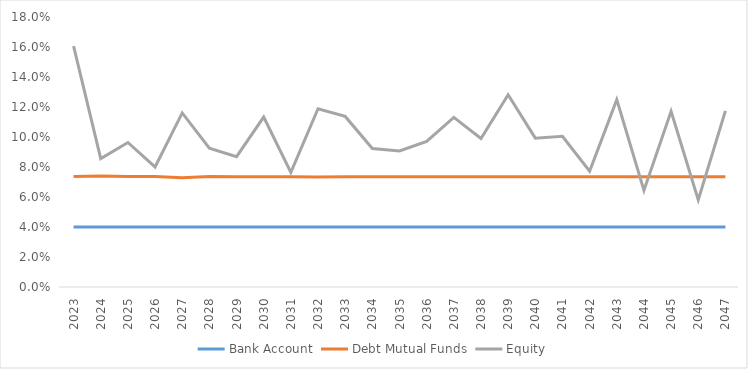
| Category | Bank Account | Debt Mutual Funds | Equity |
|---|---|---|---|
| 2023.0 | 0.04 | 0.074 | 0.161 |
| 2024.0 | 0.04 | 0.074 | 0.086 |
| 2025.0 | 0.04 | 0.074 | 0.096 |
| 2026.0 | 0.04 | 0.074 | 0.08 |
| 2027.0 | 0.04 | 0.073 | 0.116 |
| 2028.0 | 0.04 | 0.074 | 0.093 |
| 2029.0 | 0.04 | 0.074 | 0.087 |
| 2030.0 | 0.04 | 0.073 | 0.113 |
| 2031.0 | 0.04 | 0.073 | 0.076 |
| 2032.0 | 0.04 | 0.073 | 0.119 |
| 2033.0 | 0.04 | 0.074 | 0.114 |
| 2034.0 | 0.04 | 0.073 | 0.092 |
| 2035.0 | 0.04 | 0.073 | 0.091 |
| 2036.0 | 0.04 | 0.073 | 0.097 |
| 2037.0 | 0.04 | 0.073 | 0.113 |
| 2038.0 | 0.04 | 0.073 | 0.099 |
| 2039.0 | 0.04 | 0.073 | 0.128 |
| 2040.0 | 0.04 | 0.073 | 0.099 |
| 2041.0 | 0.04 | 0.073 | 0.1 |
| 2042.0 | 0.04 | 0.073 | 0.077 |
| 2043.0 | 0.04 | 0.073 | 0.125 |
| 2044.0 | 0.04 | 0.073 | 0.064 |
| 2045.0 | 0.04 | 0.073 | 0.117 |
| 2046.0 | 0.04 | 0.073 | 0.058 |
| 2047.0 | 0.04 | 0.073 | 0.117 |